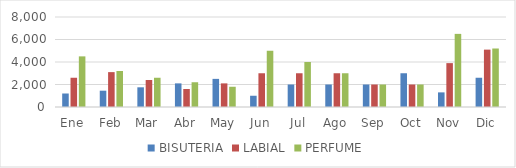
| Category | BISUTERIA | LABIAL | PERFUME |
|---|---|---|---|
| Ene | 1200 | 2600 | 4500 |
| Feb | 1450 | 3100 | 3200 |
| Mar | 1750 | 2400 | 2600 |
| Abr | 2100 | 1600 | 2200 |
| May | 2500 | 2100 | 1800 |
| Jun | 1000 | 3000 | 5000 |
| Jul | 2000 | 3000 | 4000 |
| Ago | 2000 | 3000 | 3000 |
| Sep | 2000 | 2000 | 2000 |
| Oct | 3000 | 2000 | 2000 |
| Nov | 1300 | 3900 | 6500 |
| Dic | 2600 | 5100 | 5200 |